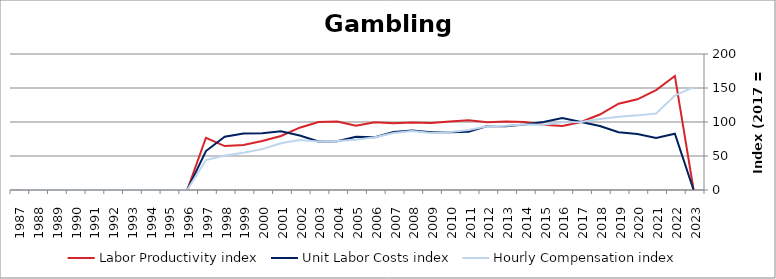
| Category | Labor Productivity index | Unit Labor Costs index | Hourly Compensation index |
|---|---|---|---|
| 2023.0 | 0 | 0 | 151.376 |
| 2022.0 | 167.763 | 82.779 | 138.872 |
| 2021.0 | 147.022 | 76.585 | 112.597 |
| 2020.0 | 133.347 | 82.305 | 109.75 |
| 2019.0 | 126.83 | 84.869 | 107.639 |
| 2018.0 | 111.005 | 94.022 | 104.369 |
| 2017.0 | 100 | 100 | 100 |
| 2016.0 | 94.303 | 105.709 | 99.687 |
| 2015.0 | 95.929 | 99.957 | 95.888 |
| 2014.0 | 99.945 | 96.356 | 96.303 |
| 2013.0 | 100.673 | 93.714 | 94.344 |
| 2012.0 | 99.623 | 94.082 | 93.727 |
| 2011.0 | 102.735 | 85.796 | 88.142 |
| 2010.0 | 100.824 | 84.766 | 85.465 |
| 2009.0 | 98.688 | 84.812 | 83.699 |
| 2008.0 | 99.201 | 87.46 | 86.761 |
| 2007.0 | 98.08 | 85.326 | 83.687 |
| 2006.0 | 99.764 | 77.735 | 77.551 |
| 2005.0 | 94.677 | 78.123 | 73.964 |
| 2004.0 | 100.791 | 71.658 | 72.225 |
| 2003.0 | 100.085 | 71.275 | 71.335 |
| 2002.0 | 91.625 | 80.207 | 73.489 |
| 2001.0 | 79.432 | 86.462 | 68.678 |
| 2000.0 | 71.943 | 83.506 | 60.077 |
| 1999.0 | 66.062 | 82.959 | 54.805 |
| 1998.0 | 64.633 | 78.299 | 50.607 |
| 1997.0 | 76.84 | 57.261 | 43.999 |
| 1996.0 | 0 | 0 | 0 |
| 1995.0 | 0 | 0 | 0 |
| 1994.0 | 0 | 0 | 0 |
| 1993.0 | 0 | 0 | 0 |
| 1992.0 | 0 | 0 | 0 |
| 1991.0 | 0 | 0 | 0 |
| 1990.0 | 0 | 0 | 0 |
| 1989.0 | 0 | 0 | 0 |
| 1988.0 | 0 | 0 | 0 |
| 1987.0 | 0 | 0 | 0 |